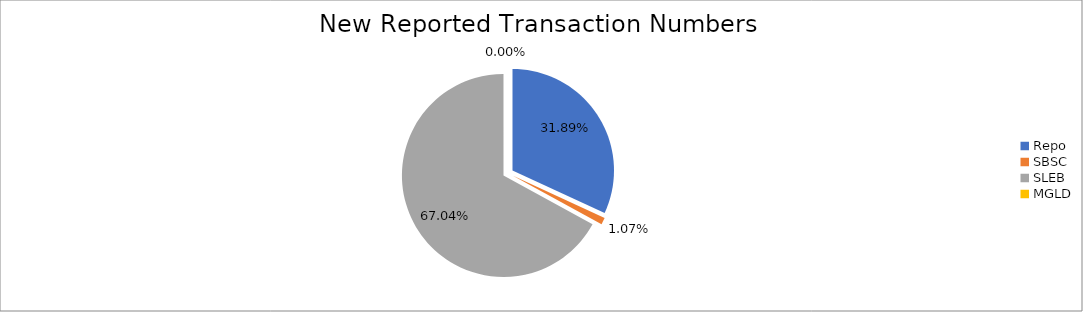
| Category | Series 0 |
|---|---|
| Repo | 293945 |
| SBSC | 9868 |
| SLEB | 617855 |
| MGLD | 22 |